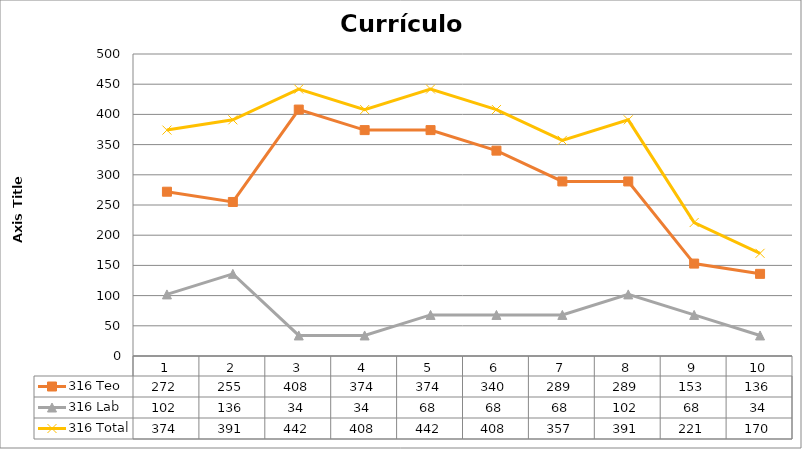
| Category | 316 Teo | 316 Lab | 316 Total |
|---|---|---|---|
| 1.0 | 272 | 102 | 374 |
| 2.0 | 255 | 136 | 391 |
| 3.0 | 408 | 34 | 442 |
| 4.0 | 374 | 34 | 408 |
| 5.0 | 374 | 68 | 442 |
| 6.0 | 340 | 68 | 408 |
| 7.0 | 289 | 68 | 357 |
| 8.0 | 289 | 102 | 391 |
| 9.0 | 153 | 68 | 221 |
| 10.0 | 136 | 34 | 170 |